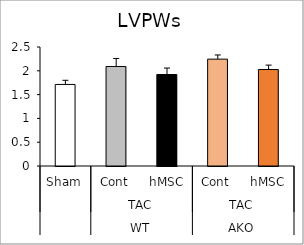
| Category | Series 0 |
|---|---|
| 0 | 1.713 |
| 1 | 2.09 |
| 2 | 1.922 |
| 3 | 2.245 |
| 4 | 2.027 |